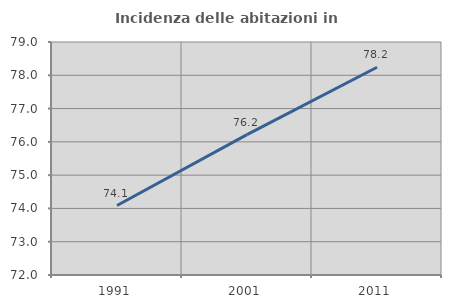
| Category | Incidenza delle abitazioni in proprietà  |
|---|---|
| 1991.0 | 74.087 |
| 2001.0 | 76.216 |
| 2011.0 | 78.242 |